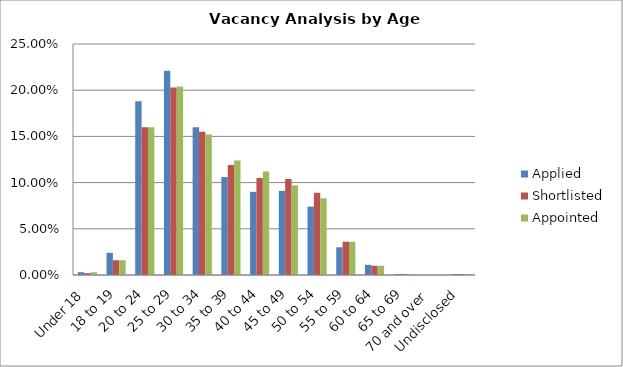
| Category | Applied | Shortlisted | Appointed |
|---|---|---|---|
| Under 18 | 0.003 | 0.002 | 0.003 |
| 18 to 19 | 0.024 | 0.016 | 0.016 |
| 20 to 24 | 0.188 | 0.16 | 0.16 |
| 25 to 29 | 0.221 | 0.203 | 0.204 |
| 30 to 34 | 0.16 | 0.155 | 0.152 |
| 35 to 39 | 0.106 | 0.119 | 0.124 |
| 40 to 44 | 0.09 | 0.105 | 0.112 |
| 45 to 49 | 0.091 | 0.104 | 0.097 |
| 50 to 54 | 0.074 | 0.089 | 0.083 |
| 55 to 59 | 0.03 | 0.036 | 0.036 |
| 60 to 64 | 0.011 | 0.01 | 0.01 |
| 65 to 69 | 0.001 | 0.001 | 0.001 |
| 70 and over | 0 | 0 | 0 |
| Undisclosed | 0.001 | 0.001 | 0.001 |